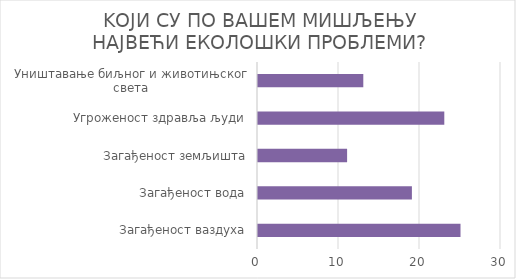
| Category | Series 3 |
|---|---|
| Загађеност ваздуха | 25 |
| Загађеност вода | 19 |
| Загађеност земљишта | 11 |
| Угроженост здравља људи | 23 |
| Уништавање биљног и животињског света | 13 |